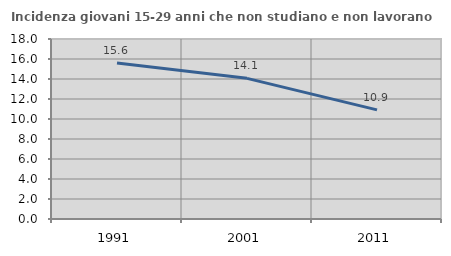
| Category | Incidenza giovani 15-29 anni che non studiano e non lavorano  |
|---|---|
| 1991.0 | 15.604 |
| 2001.0 | 14.066 |
| 2011.0 | 10.909 |